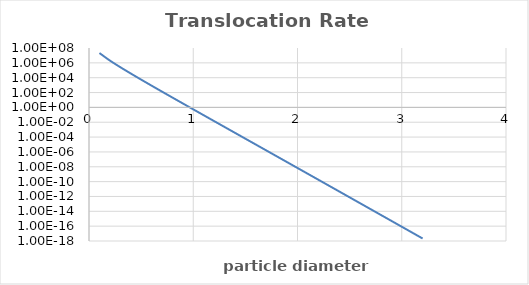
| Category | Series 0 |
|---|---|
| 0.1 | 21136948.526 |
| 0.2 | 2048884.203 |
| 0.3 | 261079.705 |
| 0.4 | 36954.778 |
| 0.5 | 5516.274 |
| 0.6 | 848.956 |
| 0.7 | 133.143 |
| 0.8 | 21.137 |
| 0.9 | 3.383 |
| 1.0 | 0.544 |
| 1.1 | 0.088 |
| 1.2 | 0.014 |
| 1.3 | 0.002 |
| 1.4 | 0 |
| 1.5 | 0 |
| 1.6 | 0 |
| 1.7 | 0 |
| 1.8 | 0 |
| 1.9 | 0 |
| 2.0 | 0 |
| 2.1 | 0 |
| 2.2 | 0 |
| 2.3 | 0 |
| 2.4 | 0 |
| 2.5 | 0 |
| 2.6 | 0 |
| 2.7 | 0 |
| 2.8 | 0 |
| 2.9 | 0 |
| 3.0 | 0 |
| 3.1 | 0 |
| 3.2 | 0 |